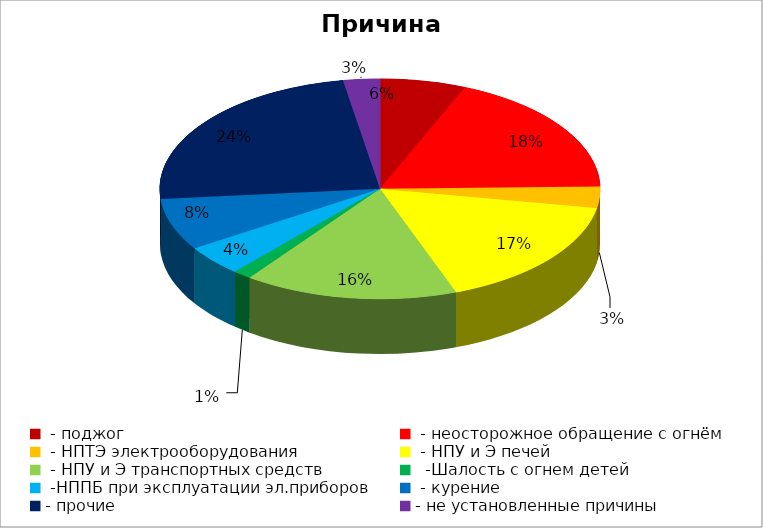
| Category | Причина пожара |
|---|---|
|  - поджог | 14 |
|  - неосторожное обращение с огнём | 41 |
|  - НПТЭ электрооборудования | 7 |
|  - НПУ и Э печей | 37 |
|  - НПУ и Э транспортных средств | 35 |
|   -Шалость с огнем детей | 3 |
|  -НППБ при эксплуатации эл.приборов | 10 |
|  - курение | 17 |
| - прочие | 53 |
| - не установленные причины | 6 |